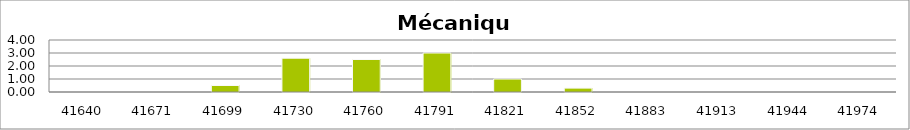
| Category | Mécanique |
|---|---|
| 2014-01-01 | 0 |
| 2014-02-01 | 0 |
| 2014-03-01 | 0.5 |
| 2014-04-01 | 2.6 |
| 2014-05-01 | 2.5 |
| 2014-06-01 | 3 |
| 2014-07-01 | 1 |
| 2014-08-01 | 0.3 |
| 2014-09-01 | 0 |
| 2014-10-01 | 0 |
| 2014-11-01 | 0 |
| 2014-12-01 | 0 |